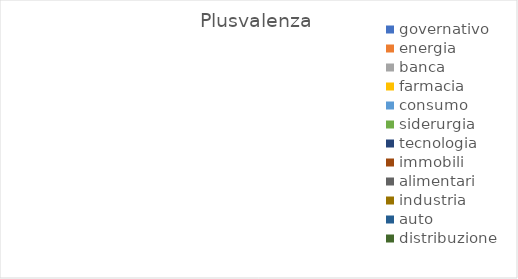
| Category | Plusvalenza |
|---|---|
| governativo | 0 |
| energia | 0 |
| banca | 0 |
| farmacia | 0 |
| consumo | 0 |
| siderurgia | 0 |
| tecnologia | 0 |
| immobili | 0 |
| alimentari | 0 |
| industria | 0 |
| auto | 0 |
| distribuzione | 0 |